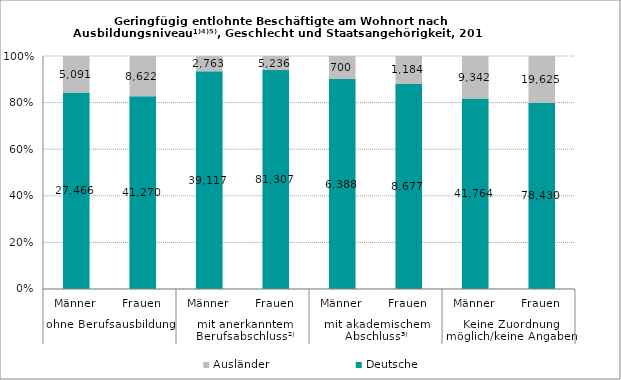
| Category | Deutsche | Ausländer |
|---|---|---|
| 0 | 27466 | 5091 |
| 1 | 41270 | 8622 |
| 2 | 39117 | 2763 |
| 3 | 81307 | 5236 |
| 4 | 6388 | 700 |
| 5 | 8677 | 1184 |
| 6 | 41764 | 9342 |
| 7 | 78430 | 19625 |